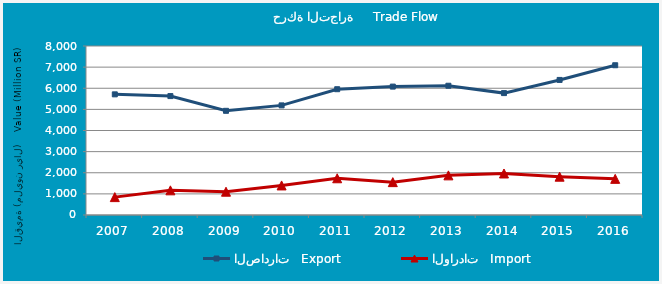
| Category | الصادرات   Export | الواردات   Import |
|---|---|---|
| 2007.0 | 5711.424 | 846.656 |
| 2008.0 | 5628.863 | 1167.869 |
| 2009.0 | 4931.889 | 1103.323 |
| 2010.0 | 5188.715 | 1399.5 |
| 2011.0 | 5954.266 | 1738.3 |
| 2012.0 | 6078.044 | 1555.73 |
| 2013.0 | 6118.769 | 1876.194 |
| 2014.0 | 5770.261 | 1964.517 |
| 2015.0 | 6393.985 | 1813.284 |
| 2016.0 | 7089.084 | 1710.262 |